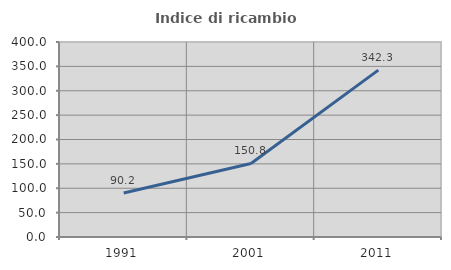
| Category | Indice di ricambio occupazionale  |
|---|---|
| 1991.0 | 90.206 |
| 2001.0 | 150.781 |
| 2011.0 | 342.308 |